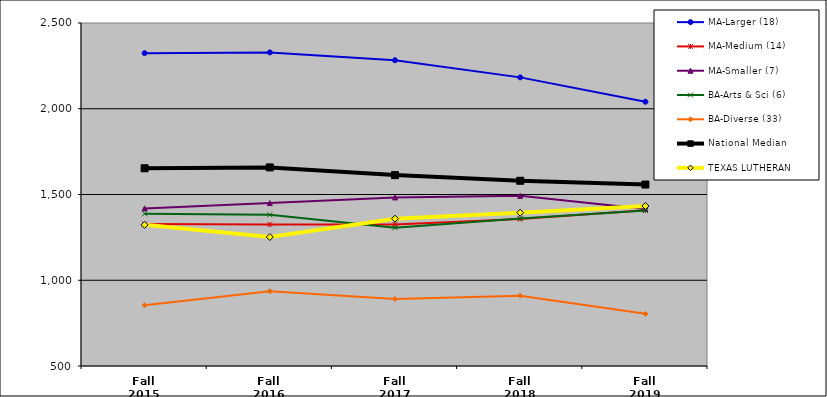
| Category | MA-Larger (18) | MA-Medium (14) | MA-Smaller (7) | BA-Arts & Sci (6) | BA-Diverse (33) | National Median | TEXAS LUTHERAN |
|---|---|---|---|---|---|---|---|
| Fall 2015 | 2324 | 1328.5 | 1419 | 1387.5 | 854 | 1653 | 1323 |
| Fall 2016 | 2328.5 | 1325 | 1450 | 1381.5 | 936 | 1658 | 1252 |
| Fall 2017 | 2283 | 1324.5 | 1483 | 1306 | 891 | 1613 | 1359 |
| Fall 2018 | 2183 | 1357.5 | 1492 | 1360 | 910 | 1580 | 1394 |
| Fall 2019 | 2041 | 1407.5 | 1416 | 1406.5 | 804 | 1558 | 1433 |